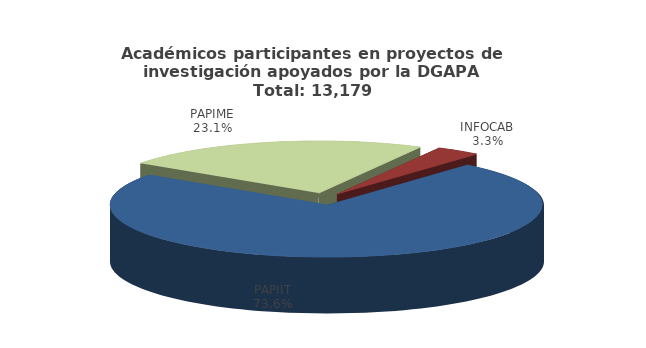
| Category | Series 0 |
|---|---|
| PAPIIT | 9697 |
| PAPIME | 3041 |
| INFOCAB | 441 |